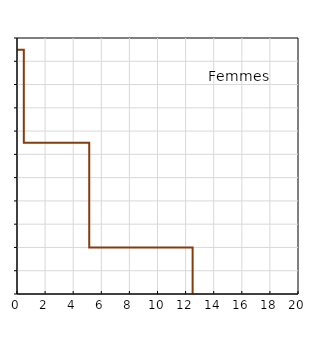
| Category | Femmes |
|---|---|
| 12.5 | 0 |
| 12.5 | 20 |
| 5.140961857379768 | 20 |
| 5.140961857379768 | 65 |
| 0.48507462686567165 | 65 |
| 0.48507462686567165 | 105 |
| 0.0 | 105 |